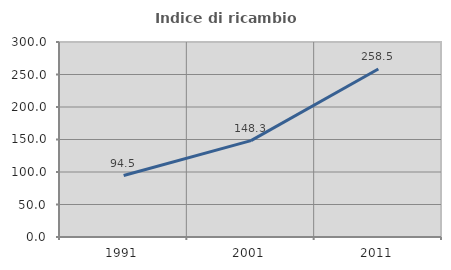
| Category | Indice di ricambio occupazionale  |
|---|---|
| 1991.0 | 94.515 |
| 2001.0 | 148.315 |
| 2011.0 | 258.537 |